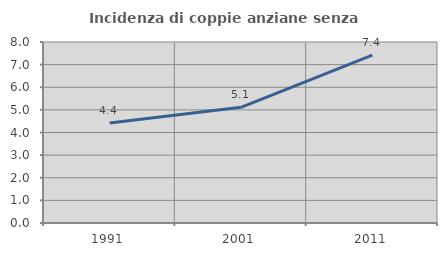
| Category | Incidenza di coppie anziane senza figli  |
|---|---|
| 1991.0 | 4.415 |
| 2001.0 | 5.112 |
| 2011.0 | 7.419 |